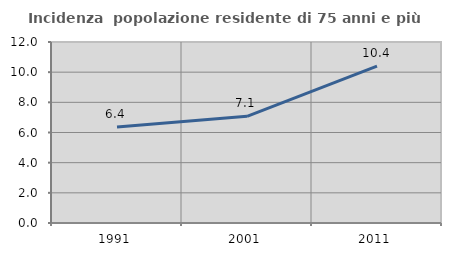
| Category | Incidenza  popolazione residente di 75 anni e più |
|---|---|
| 1991.0 | 6.37 |
| 2001.0 | 7.073 |
| 2011.0 | 10.395 |